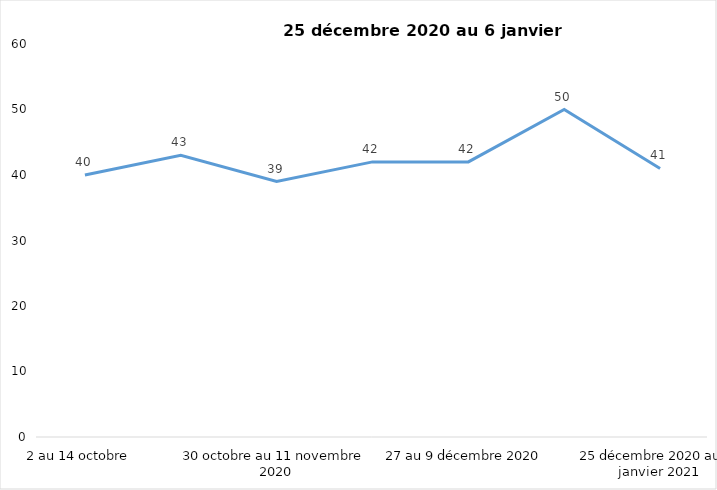
| Category | Toujours aux trois mesures |
|---|---|
| 2 au 14 octobre  | 40 |
| 16 au 28 octobre 2020 | 43 |
| 30 octobre au 11 novembre 2020 | 39 |
| 13 au 25 novembre 2020 | 42 |
| 27 au 9 décembre 2020 | 42 |
| 11 au 25 décembre 2020 | 50 |
| 25 décembre 2020 au 6 janvier 2021 | 41 |